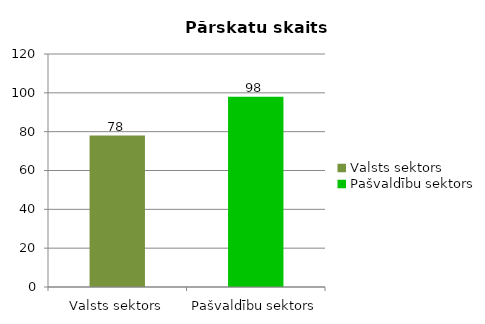
| Category |  Pārskatu skaits |
|---|---|
| Valsts sektors | 78 |
| Pašvaldību sektors | 98 |